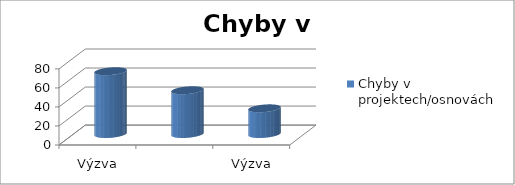
| Category | Chyby v projektech/osnovách |
|---|---|
| Výzva 1/2009 - 19 projektů | 66 |
| Výzva 2/2010 - 22 projektů  | 46 |
| Výzva 3/2011 - 8 projektů  | 27 |